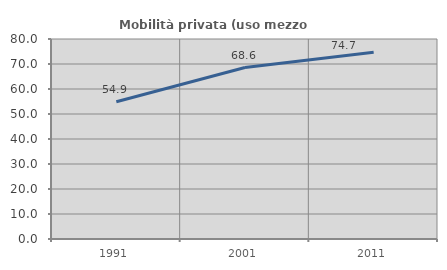
| Category | Mobilità privata (uso mezzo privato) |
|---|---|
| 1991.0 | 54.876 |
| 2001.0 | 68.596 |
| 2011.0 | 74.686 |